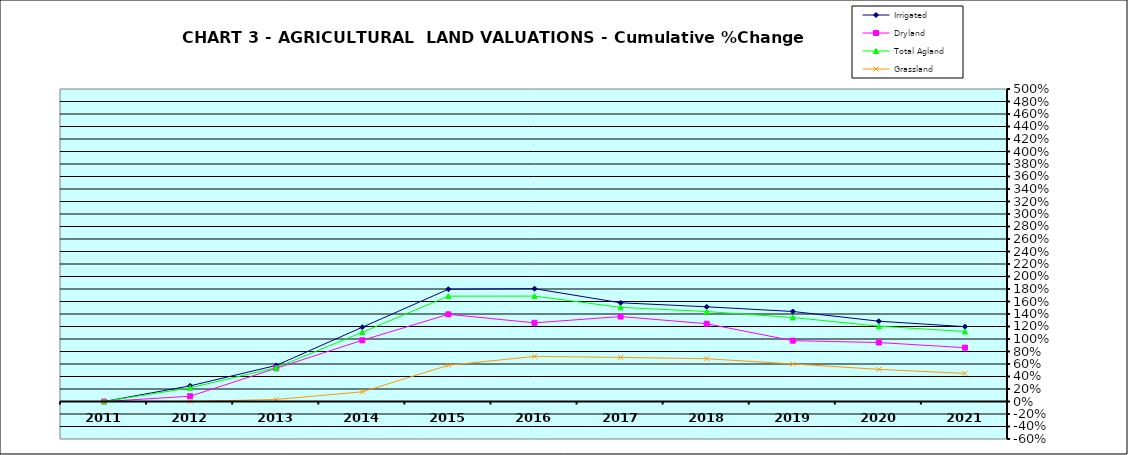
| Category | Irrigated | Dryland | Total Agland | Grassland |
|---|---|---|---|---|
| 2011.0 | 0 | 0 | 0 | 0 |
| 2012.0 | 0.25 | 0.085 | 0.219 | 0.001 |
| 2013.0 | 0.577 | 0.531 | 0.541 | 0.033 |
| 2014.0 | 1.189 | 0.98 | 1.108 | 0.155 |
| 2015.0 | 1.797 | 1.395 | 1.686 | 0.58 |
| 2016.0 | 1.805 | 1.259 | 1.686 | 0.722 |
| 2017.0 | 1.579 | 1.359 | 1.506 | 0.706 |
| 2018.0 | 1.515 | 1.245 | 1.44 | 0.685 |
| 2019.0 | 1.44 | 0.973 | 1.344 | 0.601 |
| 2020.0 | 1.285 | 0.944 | 1.205 | 0.514 |
| 2021.0 | 1.197 | 0.861 | 1.12 | 0.449 |